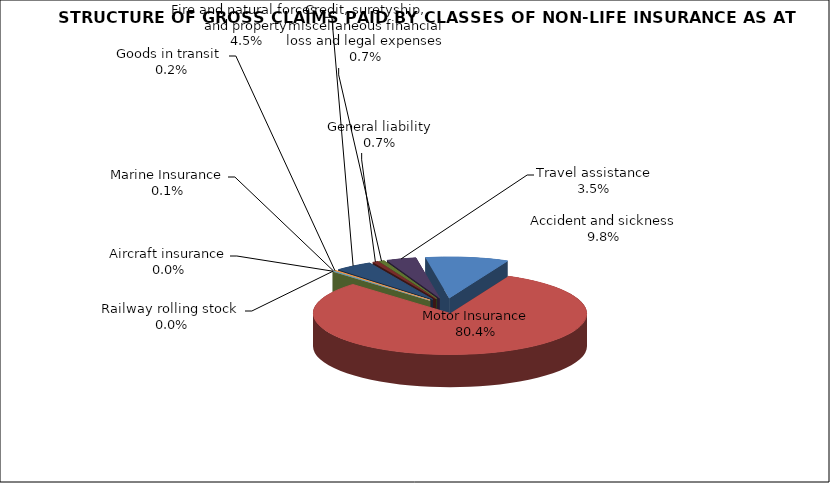
| Category | Accident and sickness |
|---|---|
| Accident and sickness | 0.098 |
| Motor Insurance | 0.804 |
| Railway rolling stock  | 0 |
| Aircraft insurance | 0 |
| Marine Insurance | 0.001 |
| Goods in transit  | 0.002 |
| Fire and natural forces and property | 0.045 |
| General liability | 0.007 |
| Credit, suretyship, miscellaneous financial loss and legal expenses | 0.007 |
| Travel assistance | 0.035 |